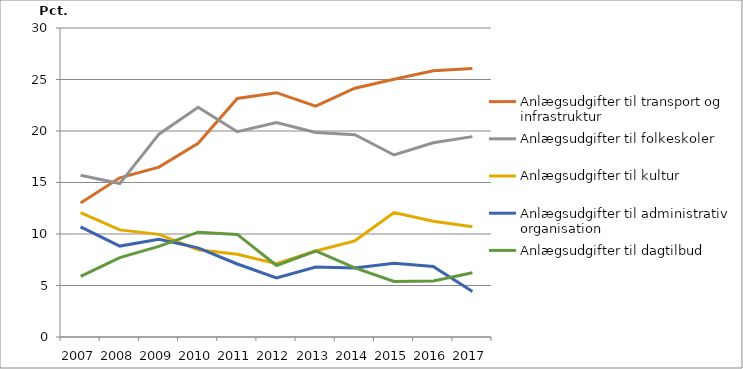
| Category | Anlægsudgifter til transport og infrastruktur | Anlægsudgifter til folkeskoler | Anlægsudgifter til kultur | Anlægsudgifter til administrativ organisation | Anlægsudgifter til dagtilbud |
|---|---|---|---|---|---|
| 2007.0 | 13.019 | 15.712 | 12.071 | 10.692 | 5.876 |
| 2008.0 | 15.457 | 14.897 | 10.4 | 8.826 | 7.703 |
| 2009.0 | 16.49 | 19.69 | 9.965 | 9.479 | 8.803 |
| 2010.0 | 18.807 | 22.306 | 8.478 | 8.656 | 10.177 |
| 2011.0 | 23.155 | 19.928 | 8.037 | 7.09 | 9.96 |
| 2012.0 | 23.72 | 20.814 | 7.119 | 5.726 | 6.94 |
| 2013.0 | 22.416 | 19.863 | 8.353 | 6.794 | 8.352 |
| 2014.0 | 24.155 | 19.634 | 9.337 | 6.689 | 6.714 |
| 2015.0 | 25.021 | 17.671 | 12.076 | 7.167 | 5.4 |
| 2016.0 | 25.846 | 18.86 | 11.244 | 6.851 | 5.43 |
| 2017.0 | 26.078 | 19.456 | 10.693 | 4.42 | 6.229 |